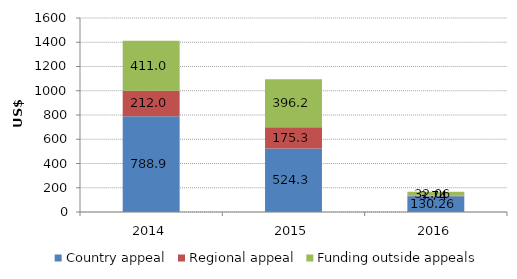
| Category | Country appeal | Regional appeal | Funding outside appeals |
|---|---|---|---|
| 2014.0 | 788.872 | 211.984 | 411.027 |
| 2015.0 | 524.305 | 175.305 | 396.157 |
| 2016.0 | 130.264 | 3.743 | 32.057 |